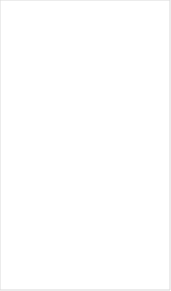
| Category | Max Requested | Min Requested | Median Requested | Mean Requested |
|---|---|---|---|---|
| Total | 489972 | 5000 | 165319 | 191630.671 |